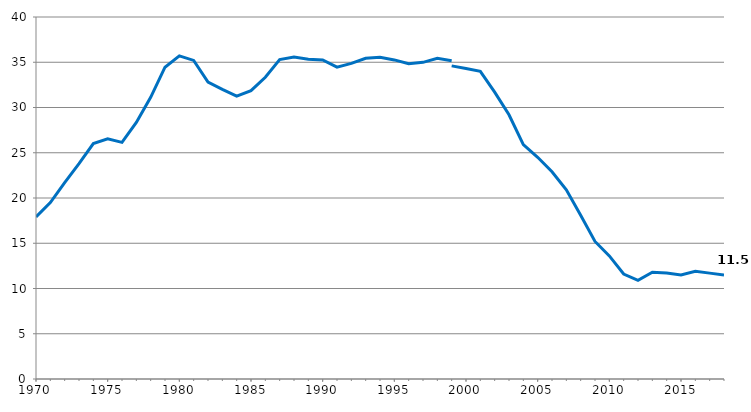
| Category | Series 0 |
|---|---|
| 1970.0 | 17.9 |
| 1971.0 | 19.5 |
| 1972.0 | 21.7 |
| 1973.0 | 23.8 |
| 1974.0 | 26.02 |
| 1975.0 | 26.55 |
| 1976.0 | 26.15 |
| 1977.0 | 28.35 |
| 1978.0 | 31.12 |
| 1979.0 | 34.45 |
| 1980.0 | 35.7 |
| 1981.0 | 35.2 |
| 1982.0 | 32.8 |
| 1983.0 | 32 |
| 1984.0 | 31.261 |
| 1985.0 | 31.865 |
| 1986.0 | 33.344 |
| 1987.0 | 35.303 |
| 1988.0 | 35.581 |
| 1989.0 | 35.34 |
| 1990.0 | 35.247 |
| 1991.0 | 34.453 |
| 1992.0 | 34.875 |
| 1993.0 | 35.446 |
| 1994.0 | 35.544 |
| 1995.0 | 35.258 |
| 1996.0 | 34.829 |
| 1997.0 | 34.99 |
| 1998.0 | 35.437 |
| 1999.0 | 35.169 |
| 1999.0 | 34.6 |
| 2000.0 | 34.3 |
| 2001.0 | 34 |
| 2002.0 | 31.7 |
| 2003.0 | 29.2 |
| 2004.0 | 25.9 |
| 2005.0 | 24.5 |
| 2006.0 | 22.9 |
| 2007.0 | 20.9 |
| 2008.0 | 18.1 |
| 2009.0 | 15.2 |
| 2010.0 | 13.6 |
| 2011.0 | 11.6 |
| 2011.0 | 11.5 |
| 2012.0 | 10.9 |
| 2013.0 | 11.8 |
| 2014.0 | 11.7 |
| 2015.0 | 11.5 |
| 2016.0 | 11.9 |
| 2017.0 | 11.7 |
| 2018.0 | 11.5 |